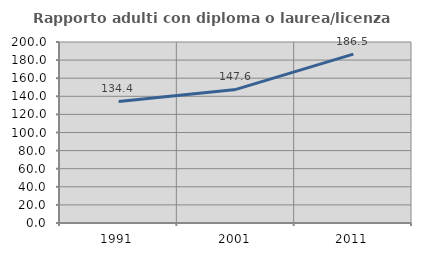
| Category | Rapporto adulti con diploma o laurea/licenza media  |
|---|---|
| 1991.0 | 134.351 |
| 2001.0 | 147.619 |
| 2011.0 | 186.547 |